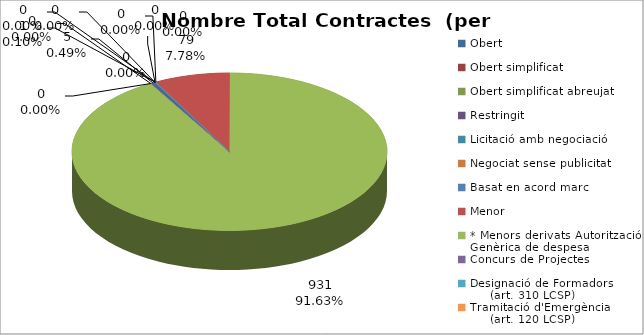
| Category | Nombre Total Contractes |
|---|---|
| Obert | 5 |
| Obert simplificat | 0 |
| Obert simplificat abreujat | 0 |
| Restringit | 0 |
| Licitació amb negociació | 0 |
| Negociat sense publicitat | 1 |
| Basat en acord marc | 0 |
| Menor | 79 |
| * Menors derivats Autorització Genèrica de despesa | 931 |
| Concurs de Projectes | 0 |
| Designació de Formadors
     (art. 310 LCSP) | 0 |
| Tramitació d'Emergència
     (art. 120 LCSP) | 0 |